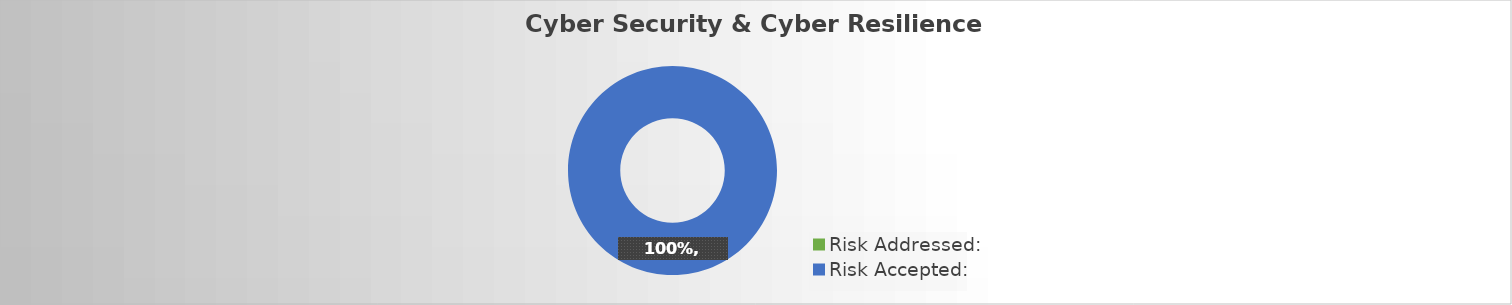
| Category | Series 1 |
|---|---|
| Risk Addressed: | 0 |
| Risk Accepted: | 1 |